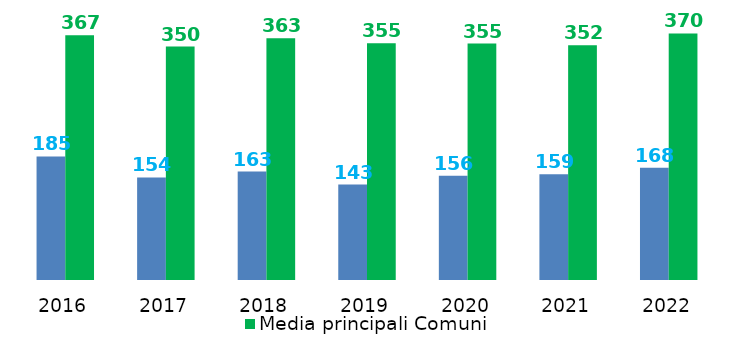
| Category | Spesa di personale procapite | Media principali Comuni |
|---|---|---|
| 2016.0 | 185.39 | 367.132 |
| 2017.0 | 153.854 | 350.148 |
| 2018.0 | 162.67 | 362.585 |
| 2019.0 | 143.11 | 355.014 |
| 2020.0 | 156.26 | 354.727 |
| 2021.0 | 158.6 | 352.252 |
| 2022.0 | 168.38 | 369.779 |